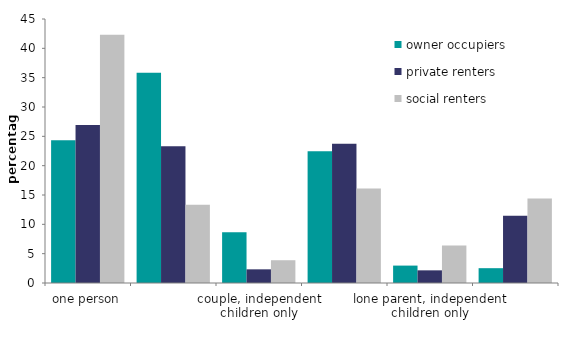
| Category | owner occupiers | private renters | social renters |
|---|---|---|---|
| one person | 24.315 | 26.927 | 42.333 |
| couple, no children | 35.845 | 23.289 | 13.336 |
| couple, independent children only | 8.64 | 2.329 | 3.882 |
| couple, dependent children | 22.446 | 23.732 | 16.104 |
| lone parent, independent children only | 2.967 | 2.158 | 6.387 |
| lone parent, dependent children | 2.525 | 11.457 | 14.394 |